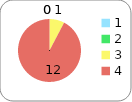
| Category | Series 0 |
|---|---|
| 0 | 0 |
| 1 | 0 |
| 2 | 1 |
| 3 | 12 |